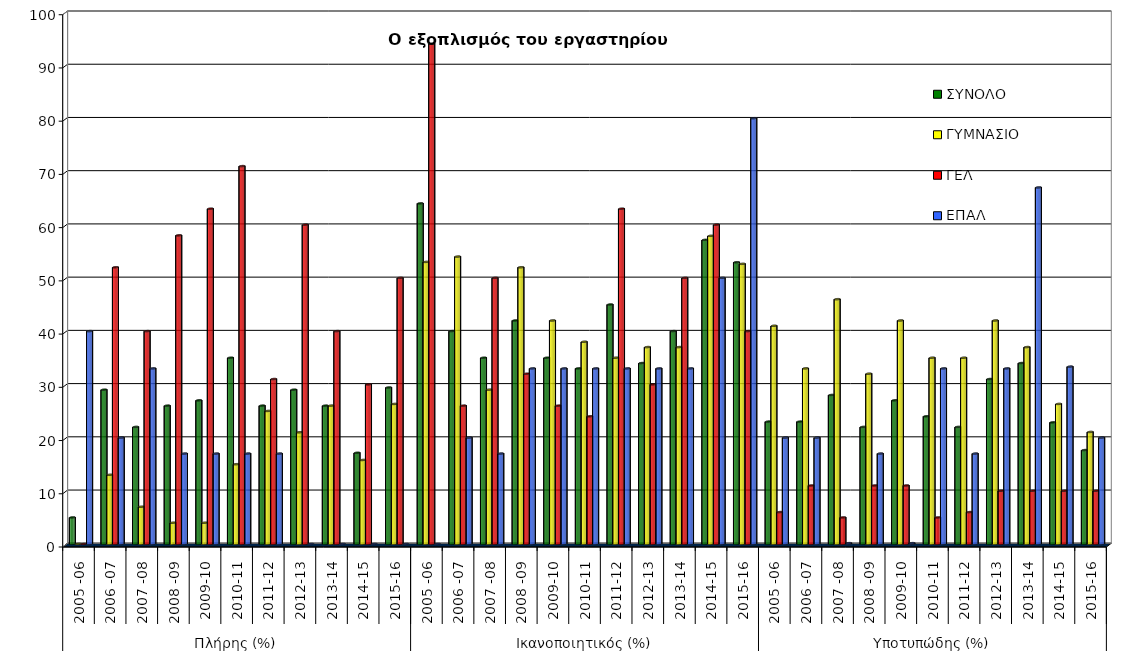
| Category | ΣΥΝΟΛΟ | ΓΥΜΝΑΣΙΟ | ΓΕΛ | ΕΠΑΛ |
|---|---|---|---|---|
| 0 | 5 | 0 | 0 | 40 |
| 1 | 29 | 13 | 52 | 20 |
| 2 | 22 | 7 | 40 | 33 |
| 3 | 26 | 4 | 58 | 17 |
| 4 | 27 | 4 | 63 | 17 |
| 5 | 35 | 15 | 71 | 17 |
| 6 | 26 | 25 | 31 | 17 |
| 7 | 29 | 21 | 60 | 0 |
| 8 | 26 | 26 | 40 | 0 |
| 9 | 17.143 | 15.789 | 30 | 0 |
| 10 | 29.412 | 26.316 | 50 | 0 |
| 11 | 64 | 53 | 94 | 0 |
| 12 | 40 | 54 | 26 | 20 |
| 13 | 35 | 29 | 50 | 17 |
| 14 | 42 | 52 | 32 | 33 |
| 15 | 35 | 42 | 26 | 33 |
| 16 | 33 | 38 | 24 | 33 |
| 17 | 45 | 35 | 63 | 33 |
| 18 | 34 | 37 | 30 | 33 |
| 19 | 40 | 37 | 50 | 33 |
| 20 | 57.143 | 57.895 | 60 | 50 |
| 21 | 52.941 | 52.632 | 40 | 80 |
| 22 | 23 | 41 | 6 | 20 |
| 23 | 23 | 33 | 11 | 20 |
| 24 | 28 | 46 | 5 | 0.17 |
| 25 | 22 | 32 | 11 | 17 |
| 26 | 27 | 42 | 11 | 0.17 |
| 27 | 24 | 35 | 5 | 33 |
| 28 | 22 | 35 | 6 | 17 |
| 29 | 31 | 42 | 10 | 33 |
| 30 | 34 | 37 | 10 | 67 |
| 31 | 22.857 | 26.316 | 10 | 33.333 |
| 32 | 17.647 | 21.053 | 10 | 20 |